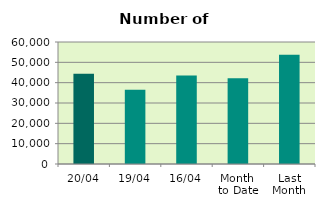
| Category | Series 0 |
|---|---|
| 20/04 | 44332 |
| 19/04 | 36468 |
| 16/04 | 43466 |
| Month 
to Date | 42142 |
| Last
Month | 53669.217 |